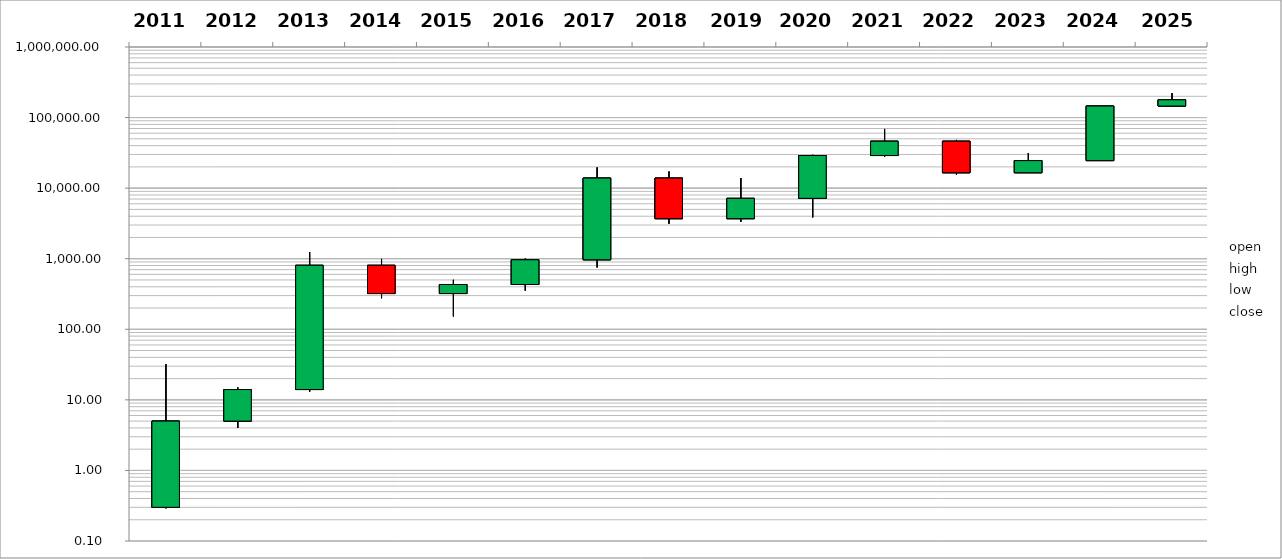
| Category | open | high | low | close |
|---|---|---|---|---|
| 2011   | 0.3 | 32 | 0.29 | 5 |
| 2012   | 5 | 15 | 4 | 14 |
| 2013   | 14 | 1242 | 13 | 806 |
| 2014   | 806 | 995 | 275 | 321 |
| 2015   | 321 | 502 | 152 | 431 |
| 2016   | 431 | 1005 | 352 | 966 |
| 2017  | 966 | 19666 | 751 | 13880 |
| 2018  | 13880 | 17235 | 3122 | 3693 |
| 2019 | 3693 | 13880 | 3322 | 7168 |
| 2020  | 7168 | 29700 | 3850 | 28993 |
| 2021  | 28993 | 69000 | 27734 | 46214 |
| 2022  | 46214 | 48234 | 15479 | 16528 |
| 2023  | 16528 | 31475 | 16496 | 24555 |
| 2024  | 24555 | 95986 | 24555 | 145678 |
| 2025 | 145678 | 222000 | 145678 | 178650 |